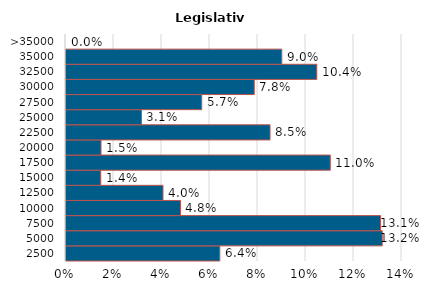
| Category | Legislativo |
|---|---|
| 2500 | 0.064 |
| 5000 | 0.132 |
| 7500 | 0.131 |
| 10000 | 0.048 |
| 12500 | 0.04 |
| 15000 | 0.014 |
| 17500 | 0.11 |
| 20000 | 0.015 |
| 22500 | 0.085 |
| 25000 | 0.031 |
| 27500 | 0.057 |
| 30000 | 0.078 |
| 32500 | 0.104 |
| 35000 | 0.09 |
| >35000 | 0 |